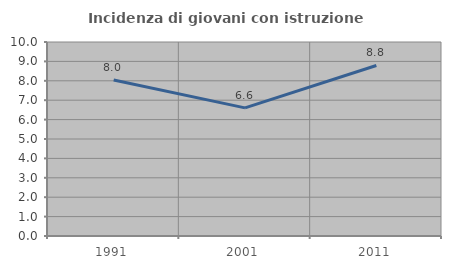
| Category | Incidenza di giovani con istruzione universitaria |
|---|---|
| 1991.0 | 8.046 |
| 2001.0 | 6.604 |
| 2011.0 | 8.791 |